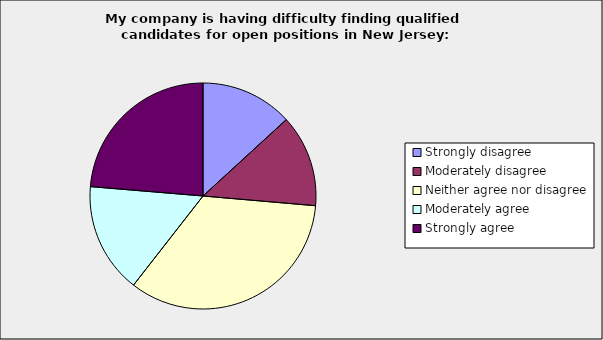
| Category | Series 0 |
|---|---|
| Strongly disagree | 0.132 |
| Moderately disagree | 0.132 |
| Neither agree nor disagree | 0.342 |
| Moderately agree | 0.158 |
| Strongly agree | 0.237 |